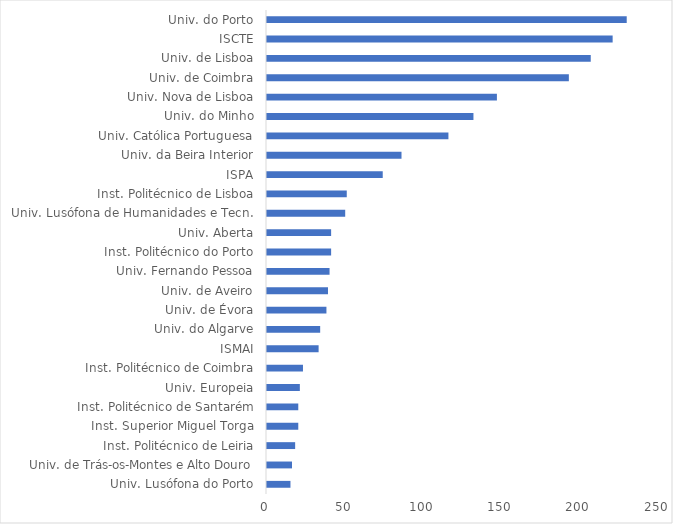
| Category | Series 0 |
|---|---|
| Univ. Lusófona do Porto | 15 |
| Univ. de Trás-os-Montes e Alto Douro | 16 |
| Inst. Politécnico de Leiria | 18 |
| Inst. Superior Miguel Torga | 20 |
| Inst. Politécnico de Santarém | 20 |
| Univ. Europeia | 21 |
| Inst. Politécnico de Coimbra | 23 |
| ISMAI | 33 |
| Univ. do Algarve | 34 |
| Univ. de Évora | 38 |
| Univ. de Aveiro | 39 |
| Univ. Fernando Pessoa | 40 |
| Inst. Politécnico do Porto | 41 |
| Univ. Aberta | 41 |
| Univ. Lusófona de Humanidades e Tecn. | 50 |
| Inst. Politécnico de Lisboa | 51 |
| ISPA | 74 |
| Univ. da Beira Interior | 86 |
| Univ. Católica Portuguesa | 116 |
| Univ. do Minho | 132 |
| Univ. Nova de Lisboa | 147 |
| Univ. de Coimbra | 193 |
| Univ. de Lisboa | 207 |
| ISCTE | 221 |
| Univ. do Porto | 230 |